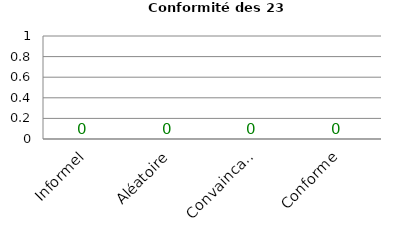
| Category | Histo Conformité |
|---|---|
| Informel | 0 |
| Aléatoire | 0 |
| Convaincant | 0 |
| Conforme | 0 |